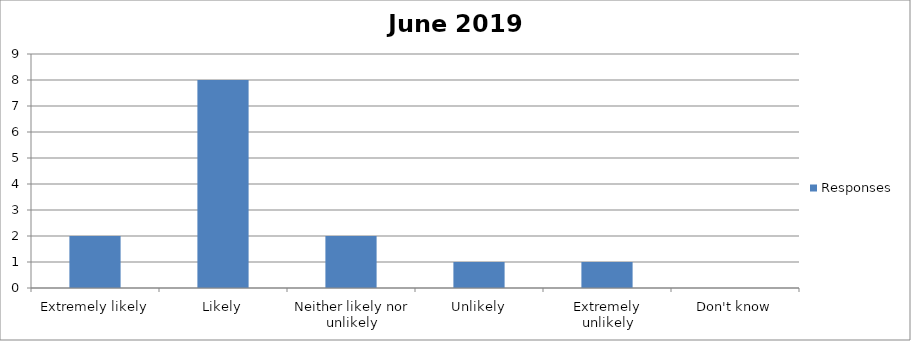
| Category | Responses |
|---|---|
| Extremely likely | 2 |
| Likely | 8 |
| Neither likely nor unlikely | 2 |
| Unlikely | 1 |
| Extremely unlikely | 1 |
| Don't know | 0 |